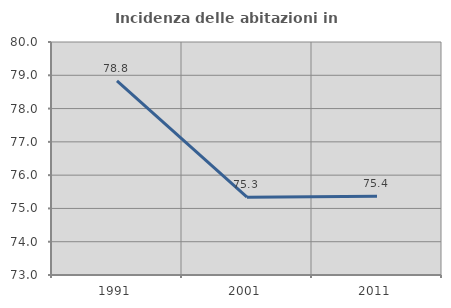
| Category | Incidenza delle abitazioni in proprietà  |
|---|---|
| 1991.0 | 78.829 |
| 2001.0 | 75.336 |
| 2011.0 | 75.362 |